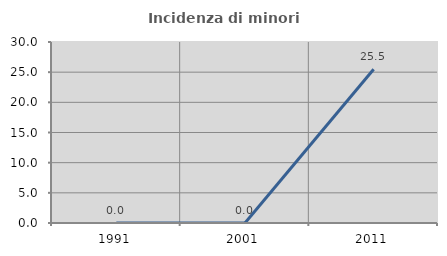
| Category | Incidenza di minori stranieri |
|---|---|
| 1991.0 | 0 |
| 2001.0 | 0 |
| 2011.0 | 25.49 |